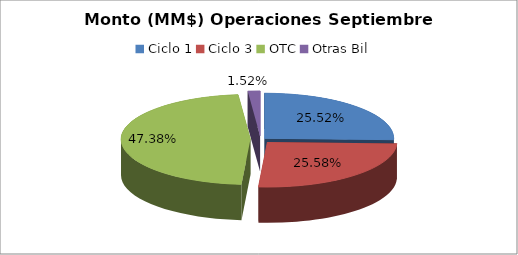
| Category | Series 0 |
|---|---|
| Ciclo 1 | 19756659.053 |
| Ciclo 3 | 19803460.861 |
| OTC | 36676651.963 |
| Otras Bil | 1179870.422 |